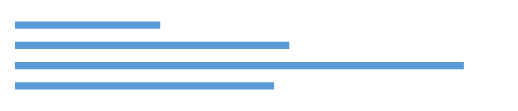
| Category | Series 0 |
|---|---|
| ΠΟΛΎ | 133 |
| ΑΡΚΕΤΑ | 252 |
| ΛΙΓΟ | 413 |
| ΚΑΘΟΛΟΥ | 238 |